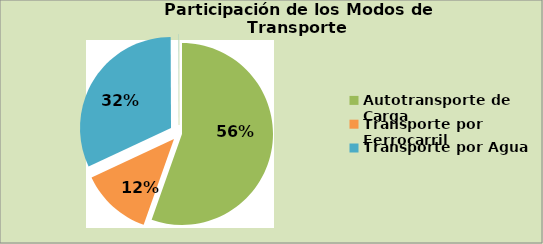
| Category | Series 0 |
|---|---|
| Autotransporte de Carga | 55.411 |
| Transporte por Ferrocarril | 12.624 |
| Transporte por Agua | 31.905 |
| Transporte Aéreo | 0.061 |